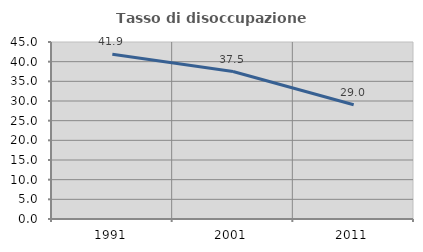
| Category | Tasso di disoccupazione giovanile  |
|---|---|
| 1991.0 | 41.912 |
| 2001.0 | 37.5 |
| 2011.0 | 29.032 |